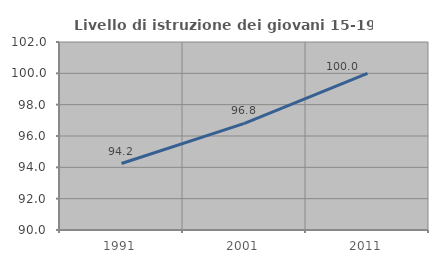
| Category | Livello di istruzione dei giovani 15-19 anni |
|---|---|
| 1991.0 | 94.245 |
| 2001.0 | 96.809 |
| 2011.0 | 100 |